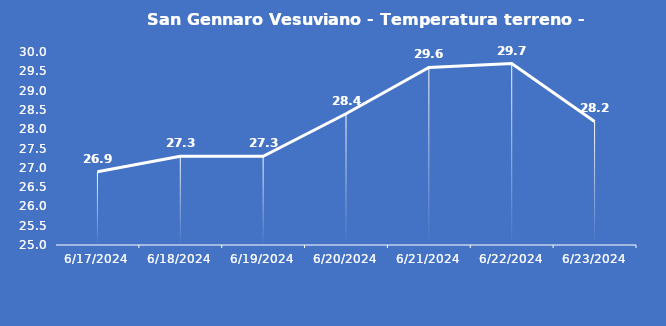
| Category | San Gennaro Vesuviano - Temperatura terreno - Grezzo (°C) |
|---|---|
| 6/17/24 | 26.9 |
| 6/18/24 | 27.3 |
| 6/19/24 | 27.3 |
| 6/20/24 | 28.4 |
| 6/21/24 | 29.6 |
| 6/22/24 | 29.7 |
| 6/23/24 | 28.2 |